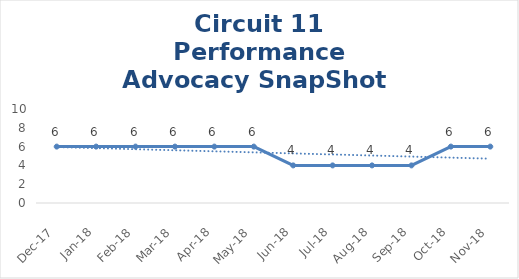
| Category | Circuit 11 |
|---|---|
| Dec-17 | 6 |
| Jan-18 | 6 |
| Feb-18 | 6 |
| Mar-18 | 6 |
| Apr-18 | 6 |
| May-18 | 6 |
| Jun-18 | 4 |
| Jul-18 | 4 |
| Aug-18 | 4 |
| Sep-18 | 4 |
| Oct-18 | 6 |
| Nov-18 | 6 |